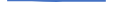
| Category | Series 0 |
|---|---|
| 0 | 36 |
| 1 | 34 |
| 2 | 35 |
| 3 | 25 |
| 4 | 20 |
| 5 | 32 |
| 6 | 25 |
| 7 | 32 |
| 8 | 27 |